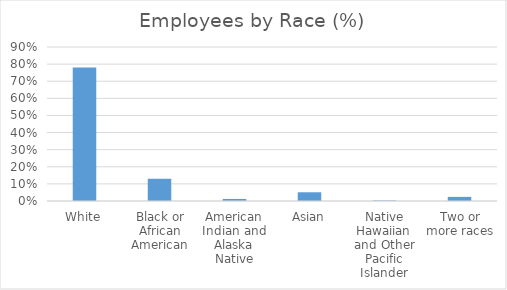
| Category | Employees by Race (%) |
|---|---|
| White | 0.78 |
| Black or African American | 0.13 |
| American Indian and Alaska Native | 0.012 |
| Asian | 0.051 |
| Native Hawaiian and Other Pacific Islander | 0.003 |
| Two or more races | 0.024 |